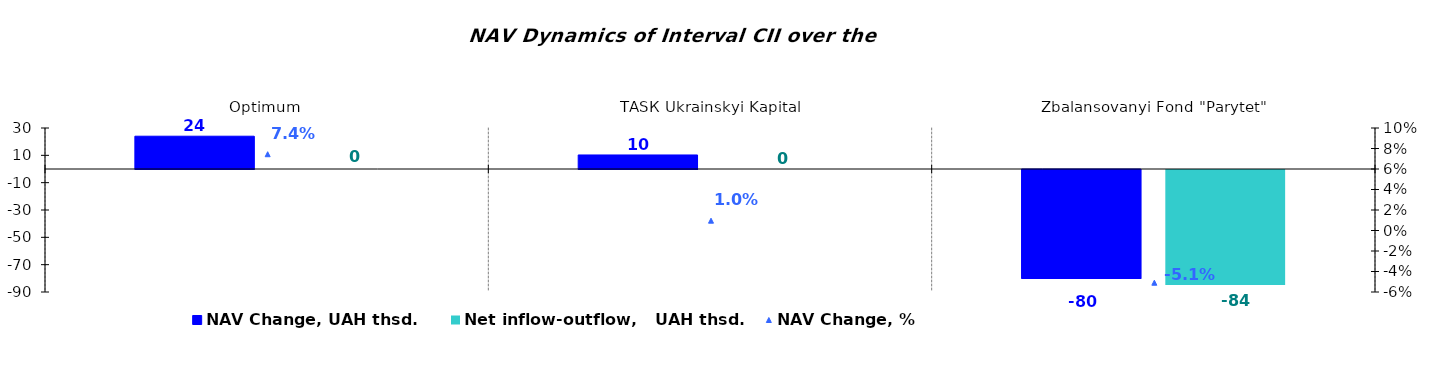
| Category | NAV Change, UAH thsd. | Net inflow-outflow,   UAH thsd. |
|---|---|---|
| Оptimum | 23.99 | 0 |
| ТАSК Ukrainskyi Kapital | 10.276 | 0 |
| Zbalansovanyi Fond "Parytet" | -79.718 | -84.142 |